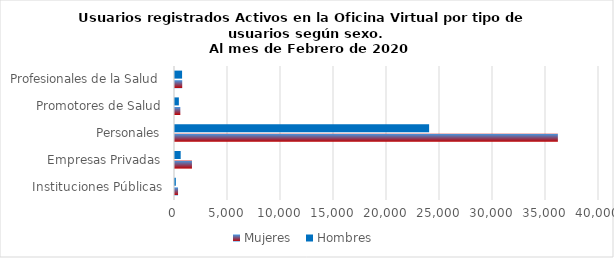
| Category | Mujeres | Hombres |
|---|---|---|
| Instituciones Públicas | 287 | 78 |
| Empresas Privadas | 1600 | 536 |
| Personales | 36121 | 23974 |
| Promotores de Salud | 502 | 365 |
| Profesionales de la Salud | 680 | 668 |